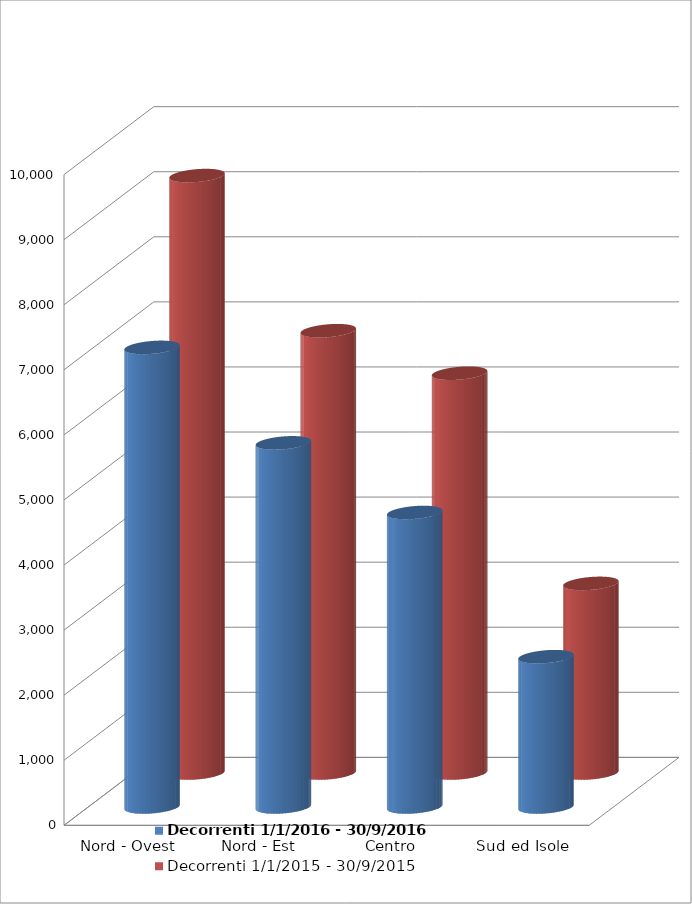
| Category | Decorrenti 1/1/2016 - 30/9/2016 | Decorrenti 1/1/2015 - 30/9/2015 |
|---|---|---|
| Nord - Ovest | 7063 | 9181 |
| Nord - Est | 5596 | 6797 |
| Centro | 4526 | 6144 |
| Sud ed Isole | 2310 | 2914 |